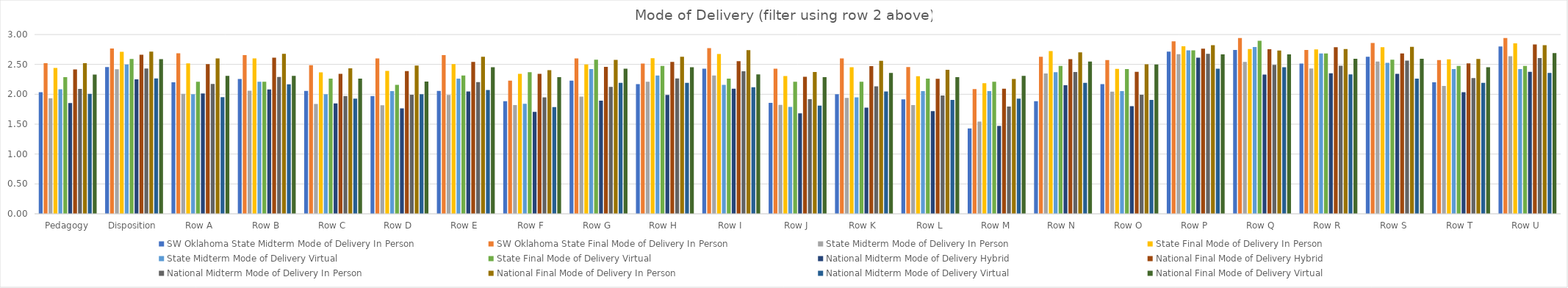
| Category | SW Oklahoma State | State | National |
|---|---|---|---|
| Pedagogy | 2.521 | 2.287 | 2.33 |
| Disposition | 2.768 | 2.592 | 2.589 |
| Row A | 2.686 | 2.21 | 2.31 |
| Row B | 2.657 | 2.21 | 2.31 |
| Row C | 2.486 | 2.263 | 2.262 |
| Row D | 2.6 | 2.158 | 2.214 |
| Row E | 2.657 | 2.316 | 2.452 |
| Row F | 2.229 | 2.368 | 2.286 |
| Row G | 2.6 | 2.579 | 2.429 |
| Row H | 2.514 | 2.474 | 2.452 |
| Row I | 2.771 | 2.263 | 2.333 |
| Row J | 2.429 | 2.21 | 2.286 |
| Row K | 2.6 | 2.21 | 2.357 |
| Row L | 2.457 | 2.263 | 2.286 |
| Row M | 2.086 | 2.21 | 2.31 |
| Row N | 2.629 | 2.474 | 2.548 |
| Row O | 2.571 | 2.421 | 2.5 |
| Row P | 2.886 | 2.737 | 2.667 |
| Row Q | 2.943 | 2.895 | 2.667 |
| Row R | 2.743 | 2.684 | 2.595 |
| Row S | 2.857 | 2.579 | 2.595 |
| Row T | 2.571 | 2.474 | 2.452 |
| Row U | 2.943 | 2.474 | 2.69 |